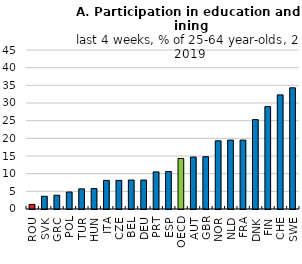
| Category | 25-64 year-olds |
|---|---|
| ROU | 1.3 |
| SVK | 3.6 |
| GRC | 3.9 |
| POL | 4.8 |
| TUR | 5.7 |
| HUN | 5.8 |
| ITA | 8.1 |
| CZE | 8.1 |
| BEL | 8.2 |
| DEU | 8.2 |
| PRT | 10.5 |
| ESP | 10.6 |
| OECD | 14.31 |
| AUT | 14.7 |
| GBR | 14.8 |
| NOR | 19.3 |
| NLD | 19.5 |
| FRA | 19.5 |
| DNK | 25.3 |
| FIN | 29 |
| CHE | 32.3 |
| SWE | 34.3 |